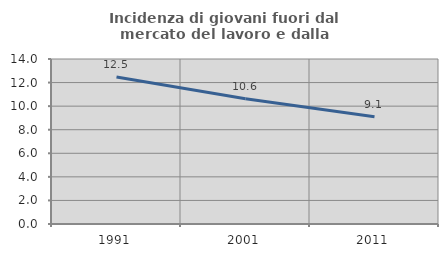
| Category | Incidenza di giovani fuori dal mercato del lavoro e dalla formazione  |
|---|---|
| 1991.0 | 12.471 |
| 2001.0 | 10.625 |
| 2011.0 | 9.091 |